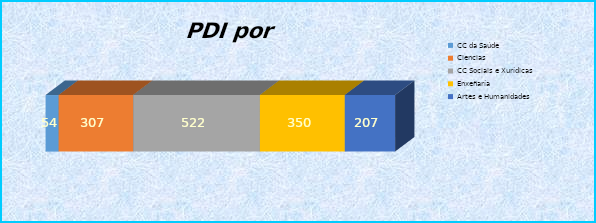
| Category | CC da Saúde | Ciencias | CC Sociais e Xurídicas | Enxeñaría | Artes e Humanidades |
|---|---|---|---|---|---|
| 0 | 54 | 307 | 522 | 350 | 207 |